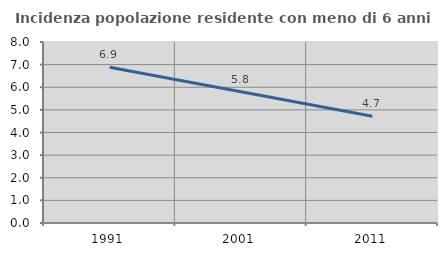
| Category | Incidenza popolazione residente con meno di 6 anni |
|---|---|
| 1991.0 | 6.885 |
| 2001.0 | 5.804 |
| 2011.0 | 4.718 |